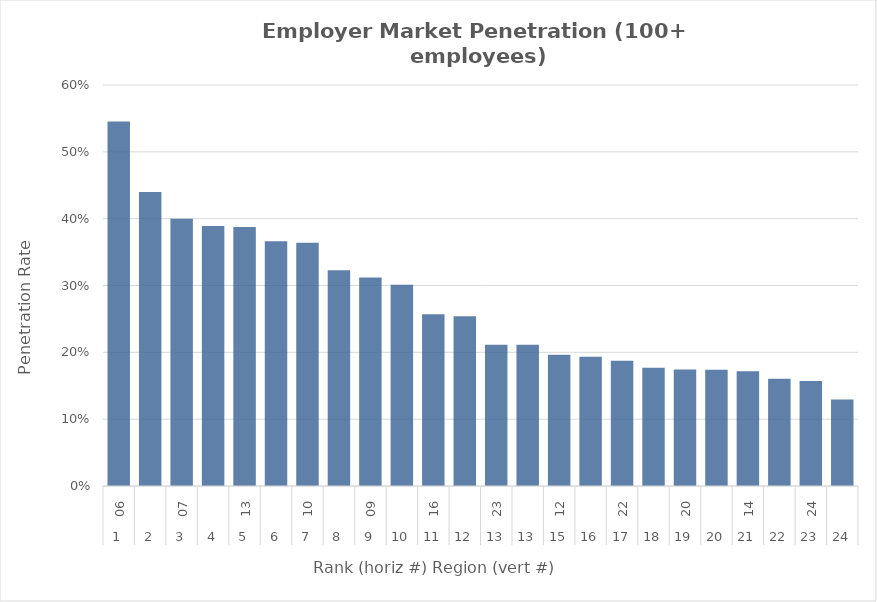
| Category | Rate |
|---|---|
| 0 | 0.545 |
| 1 | 0.44 |
| 2 | 0.4 |
| 3 | 0.389 |
| 4 | 0.388 |
| 5 | 0.366 |
| 6 | 0.364 |
| 7 | 0.323 |
| 8 | 0.312 |
| 9 | 0.301 |
| 10 | 0.257 |
| 11 | 0.254 |
| 12 | 0.211 |
| 13 | 0.211 |
| 14 | 0.197 |
| 15 | 0.193 |
| 16 | 0.187 |
| 17 | 0.177 |
| 18 | 0.174 |
| 19 | 0.174 |
| 20 | 0.172 |
| 21 | 0.16 |
| 22 | 0.157 |
| 23 | 0.129 |